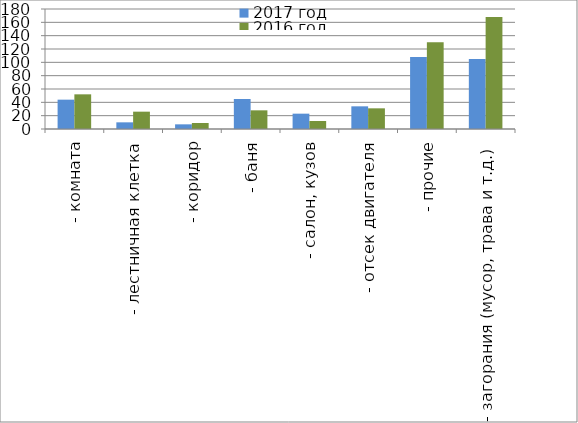
| Category | 2017 год | 2016 год |
|---|---|---|
|  - комната | 44 | 52 |
|  - лестничная клетка | 10 | 26 |
|  - коридор | 7 | 9 |
|  - баня | 45 | 28 |
|  - салон, кузов | 23 | 12 |
|  - отсек двигателя | 34 | 31 |
| - прочие | 108 | 130 |
| - загорания (мусор, трава и т.д.)  | 105 | 168 |